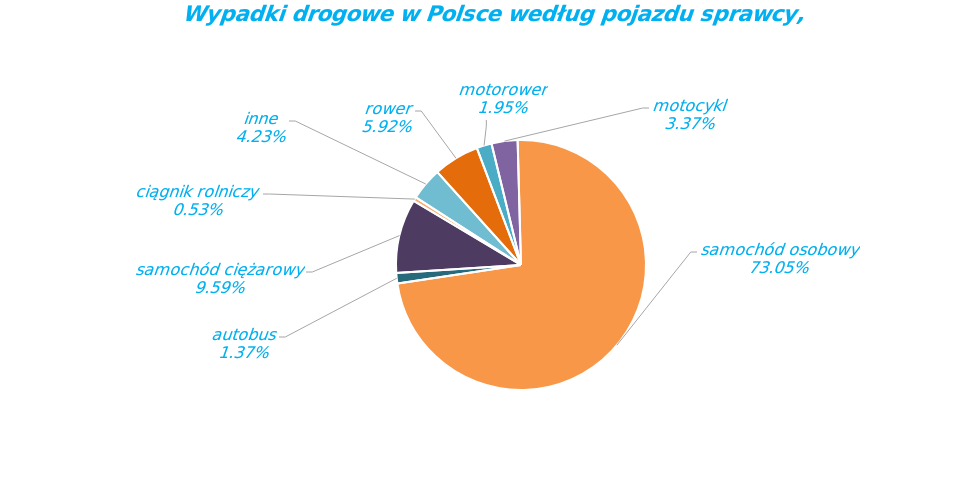
| Category | Series 0 |
|---|---|
| rower | 1221 |
| motorower | 402 |
| motocykl | 694 |
| samochód osobowy | 15066 |
| autobus | 282 |
| samochód ciężarowy | 1977 |
| ciągnik rolniczy | 109 |
| inne | 872 |